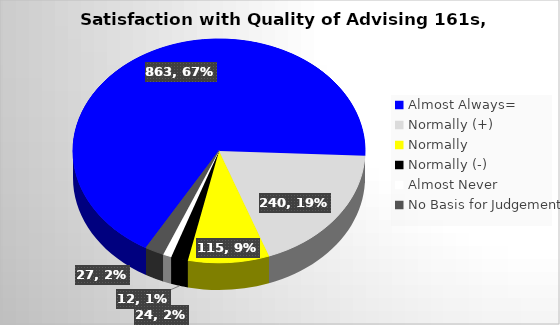
| Category | Series 0 |
|---|---|
| Almost Always= | 863 |
| Normally (+) | 240 |
| Normally  | 115 |
| Normally (-) | 24 |
| Almost Never | 12 |
| No Basis for Judgement | 27 |